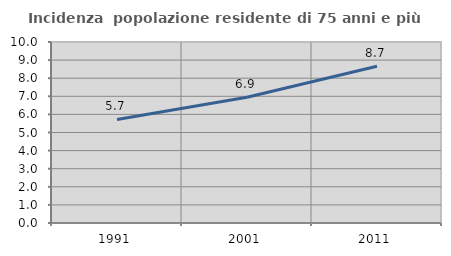
| Category | Incidenza  popolazione residente di 75 anni e più |
|---|---|
| 1991.0 | 5.718 |
| 2001.0 | 6.944 |
| 2011.0 | 8.659 |